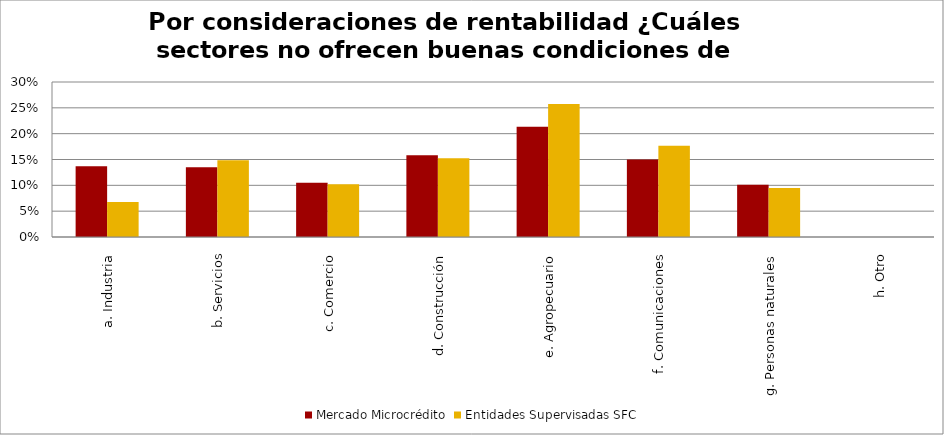
| Category | Mercado Microcrédito | Entidades Supervisadas SFC |
|---|---|---|
| a. Industria | 0.137 | 0.068 |
| b. Servicios | 0.135 | 0.149 |
| c. Comercio | 0.105 | 0.102 |
| d. Construcción | 0.158 | 0.152 |
| e. Agropecuario | 0.213 | 0.257 |
| f. Comunicaciones | 0.15 | 0.177 |
| g. Personas naturales | 0.101 | 0.095 |
| h. Otro | 0 | 0 |